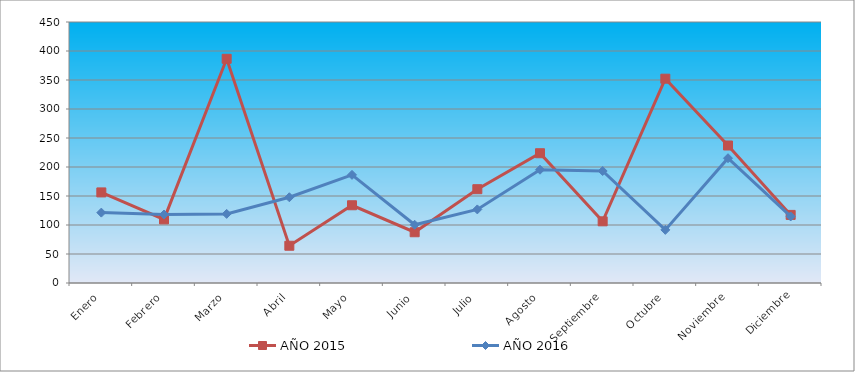
| Category | AÑO 2015 | AÑO 2016 |
|---|---|---|
| Enero | 156.183 | 121.356 |
| Febrero | 109.66 | 118.046 |
| Marzo | 386.58 | 119.149 |
| Abril | 64.245 | 147.833 |
| Mayo | 134.029 | 186.447 |
| Junio | 87.507 | 100.394 |
| Julio | 161.721 | 126.872 |
| Agosto | 223.751 | 195.272 |
| Septiembre | 106.337 | 193.066 |
| Octubre | 352.242 | 91.568 |
| Noviembre | 237.043 | 215.131 |
| Diciembre | 117.414 | 114.736 |